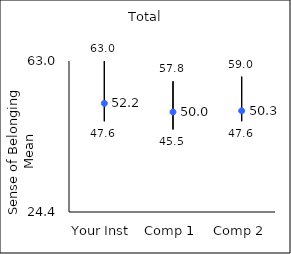
| Category | 25th percentile | 75th percentile | Mean |
|---|---|---|---|
| Your Inst | 47.6 | 63 | 52.17 |
| Comp 1 | 45.5 | 57.8 | 49.96 |
| Comp 2 | 47.6 | 59 | 50.26 |